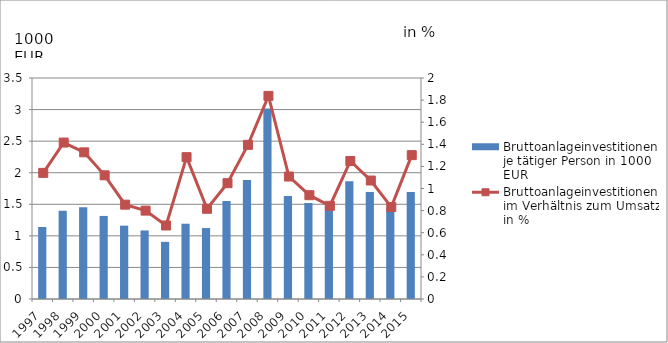
| Category | Bruttoanlageinvestitionen je tätiger Person in 1000 EUR |
|---|---|
| 1997.0 | 1.14 |
| 1998.0 | 1.4 |
| 1999.0 | 1.455 |
| 2000.0 | 1.315 |
| 2001.0 | 1.161 |
| 2002.0 | 1.086 |
| 2003.0 | 0.905 |
| 2004.0 | 1.192 |
| 2005.0 | 1.124 |
| 2006.0 | 1.554 |
| 2007.0 | 1.884 |
| 2008.0 | 3.017 |
| 2009.0 | 1.632 |
| 2010.0 | 1.521 |
| 2011.0 | 1.479 |
| 2012.0 | 1.863 |
| 2013.0 | 1.694 |
| 2014.0 | 1.448 |
| 2015.0 | 1.693 |